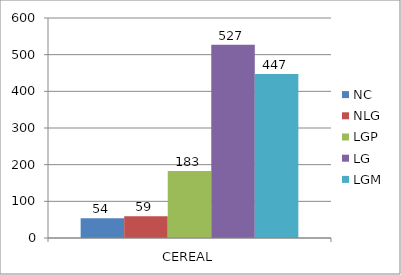
| Category | NC | NLG | LGP | LG | LGM |
|---|---|---|---|---|---|
| 0 | 54 | 59 | 183 | 527 | 447 |